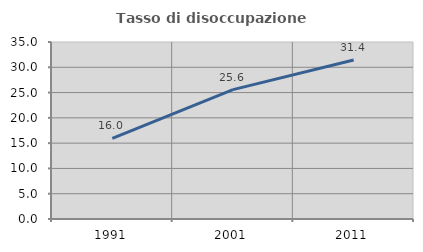
| Category | Tasso di disoccupazione giovanile  |
|---|---|
| 1991.0 | 15.957 |
| 2001.0 | 25.581 |
| 2011.0 | 31.429 |